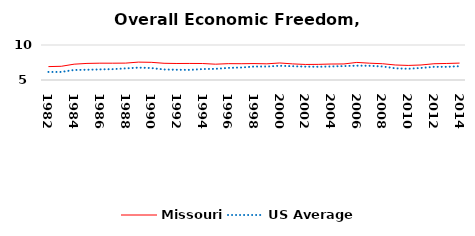
| Category | Missouri | US Average |
|---|---|---|
| 1982.0 | 6.913 | 6.149 |
| 1983.0 | 6.959 | 6.152 |
| 1984.0 | 7.261 | 6.429 |
| 1985.0 | 7.369 | 6.464 |
| 1986.0 | 7.404 | 6.512 |
| 1987.0 | 7.4 | 6.552 |
| 1988.0 | 7.413 | 6.659 |
| 1989.0 | 7.554 | 6.767 |
| 1990.0 | 7.526 | 6.71 |
| 1991.0 | 7.387 | 6.502 |
| 1992.0 | 7.358 | 6.463 |
| 1993.0 | 7.365 | 6.446 |
| 1994.0 | 7.356 | 6.563 |
| 1995.0 | 7.257 | 6.593 |
| 1996.0 | 7.336 | 6.73 |
| 1997.0 | 7.328 | 6.781 |
| 1998.0 | 7.347 | 6.926 |
| 1999.0 | 7.312 | 6.925 |
| 2000.0 | 7.433 | 7.031 |
| 2001.0 | 7.303 | 6.969 |
| 2002.0 | 7.221 | 6.912 |
| 2003.0 | 7.233 | 6.892 |
| 2004.0 | 7.283 | 6.934 |
| 2005.0 | 7.293 | 6.99 |
| 2006.0 | 7.513 | 7.048 |
| 2007.0 | 7.4 | 7.028 |
| 2008.0 | 7.326 | 6.935 |
| 2009.0 | 7.145 | 6.668 |
| 2010.0 | 7.081 | 6.605 |
| 2011.0 | 7.144 | 6.72 |
| 2012.0 | 7.322 | 6.883 |
| 2013.0 | 7.36 | 6.881 |
| 2014.0 | 7.413 | 6.973 |